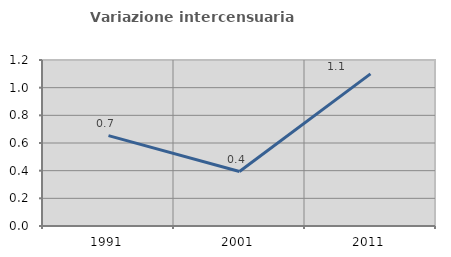
| Category | Variazione intercensuaria annua |
|---|---|
| 1991.0 | 0.653 |
| 2001.0 | 0.394 |
| 2011.0 | 1.1 |